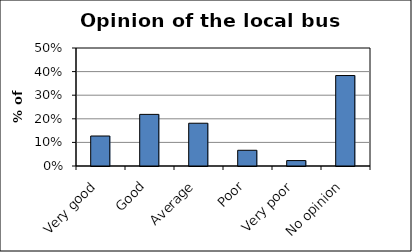
| Category | Series 0 |
|---|---|
| Very good | 0.127 |
| Good | 0.219 |
| Average | 0.181 |
| Poor | 0.067 |
| Very poor | 0.023 |
| No opinion | 0.383 |